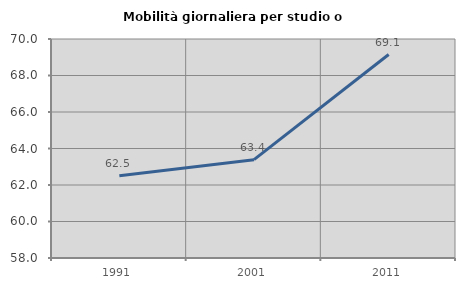
| Category | Mobilità giornaliera per studio o lavoro |
|---|---|
| 1991.0 | 62.503 |
| 2001.0 | 63.389 |
| 2011.0 | 69.149 |